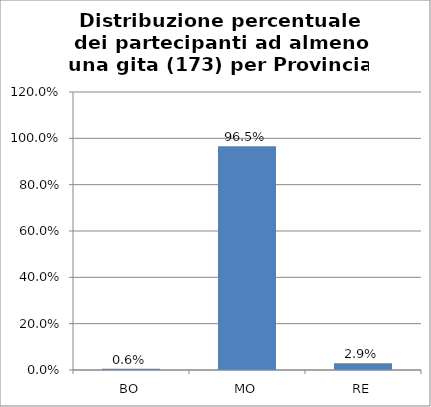
| Category | % Tesserati |
|---|---|
| BO | 0.006 |
| MO | 0.965 |
| RE | 0.029 |